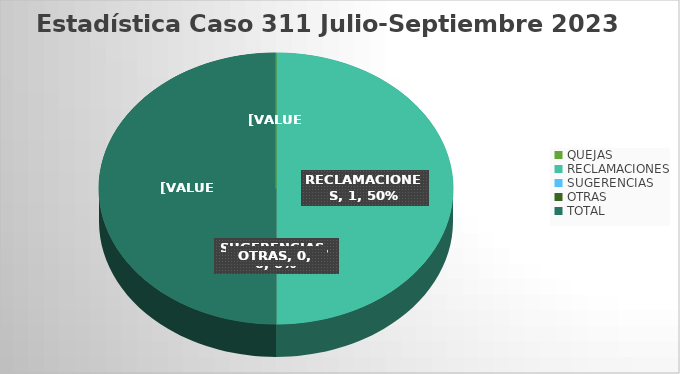
| Category | CASO | RESUELTA | PENDIENTE |
|---|---|---|---|
| QUEJAS | 0 | 0 | 0 |
| RECLAMACIONES | 1 | 1 | 0 |
| SUGERENCIAS | 0 | 0 | 0 |
| OTRAS | 0 | 0 | 0 |
| TOTAL | 1 | 1 | 0 |